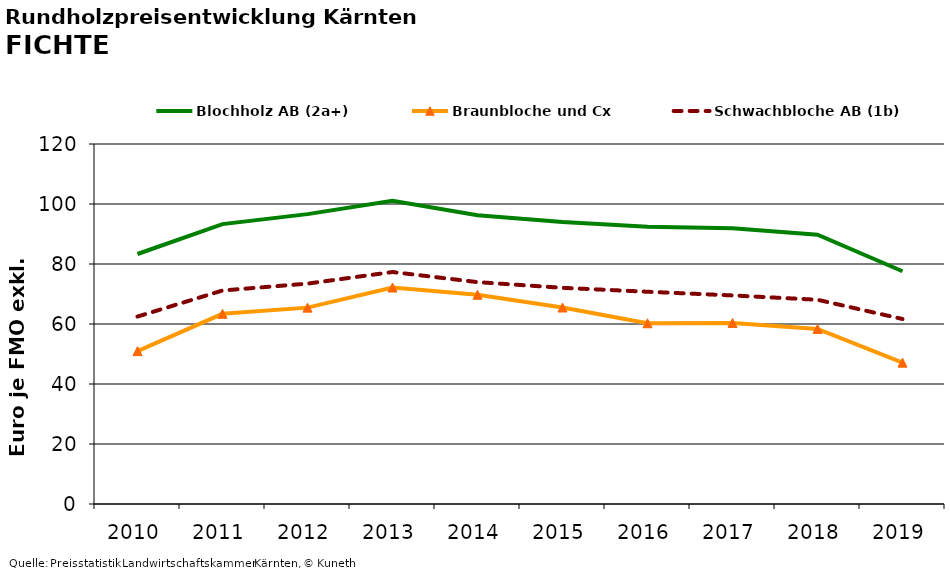
| Category | Blochholz AB (2a+) | Braunbloche und Cx | Schwachbloche AB (1b) |
|---|---|---|---|
| 2010.0 | 83.333 | 50.958 | 62.479 |
| 2011.0 | 93.292 | 63.396 | 71.167 |
| 2012.0 | 96.626 | 65.458 | 73.458 |
| 2013.0 | 101.086 | 72.167 | 77.333 |
| 2014.0 | 96.258 | 69.75 | 73.958 |
| 2015.0 | 94.029 | 65.5 | 72.062 |
| 2016.0 | 92.433 | 60.25 | 70.75 |
| 2017.0 | 91.951 | 60.354 | 69.521 |
| 2018.0 | 89.753 | 58.333 | 68.083 |
| 2019.0 | 77.576 | 47.111 | 61.667 |